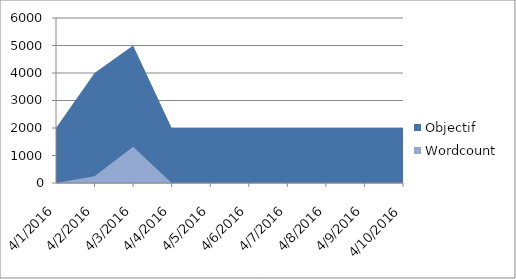
| Category | Objectif | Wordcount |
|---|---|---|
| 4/1/16 | 2000 | 0 |
| 4/2/16 | 4000 | 247 |
| 4/3/16 | 5000 | 1316 |
| 4/4/16 | 2000 | 0 |
| 4/5/16 | 2000 | 0 |
| 4/6/16 | 2000 | 0 |
| 4/7/16 | 2000 | 0 |
| 4/8/16 | 2000 | 0 |
| 4/9/16 | 2000 | 0 |
| 4/10/16 | 2000 | 0 |